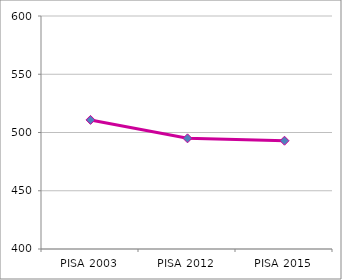
| Category | Series 0 |
|---|---|
| PISA 2003 | 510.799 |
| PISA 2012 | 494.985 |
| PISA 2015 | 492.92 |